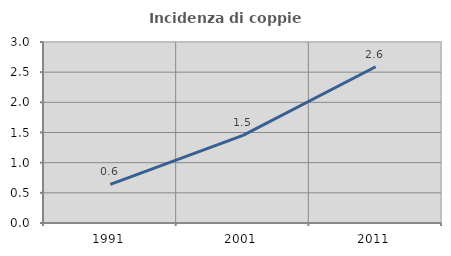
| Category | Incidenza di coppie miste |
|---|---|
| 1991.0 | 0.639 |
| 2001.0 | 1.453 |
| 2011.0 | 2.59 |